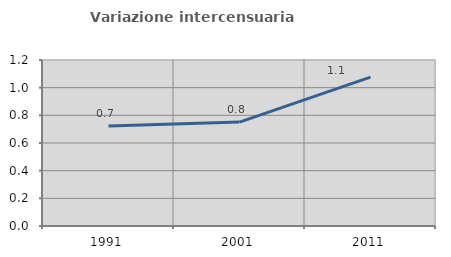
| Category | Variazione intercensuaria annua |
|---|---|
| 1991.0 | 0.722 |
| 2001.0 | 0.751 |
| 2011.0 | 1.077 |